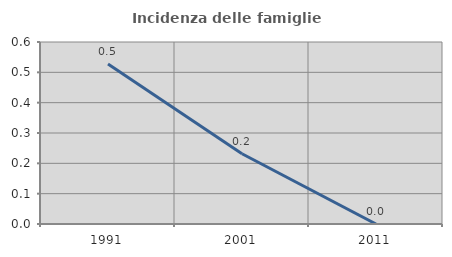
| Category | Incidenza delle famiglie numerose |
|---|---|
| 1991.0 | 0.528 |
| 2001.0 | 0.231 |
| 2011.0 | 0 |